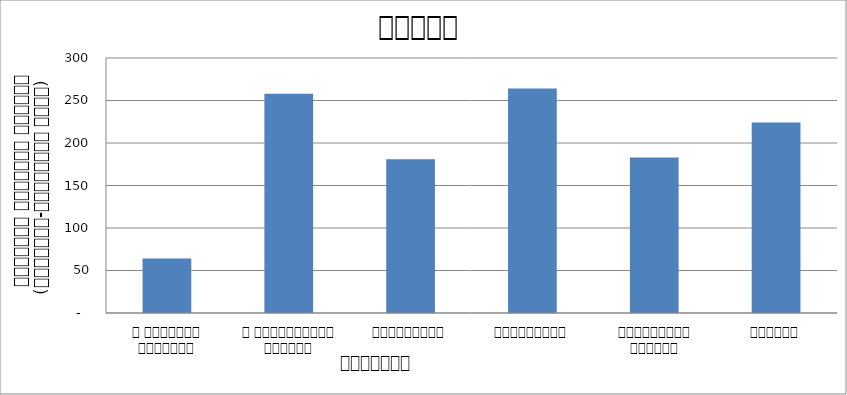
| Category | Total |
|---|---|
| द हिमालयन टाइम्स् | 64 |
| द काठमाण्डौं पोस्ट् | 258 |
| रिपब्लिका | 181 |
| कान्तिपुर | 264 |
| अन्नपूर्ण पोस्ट् | 183 |
| नागरिक | 224 |